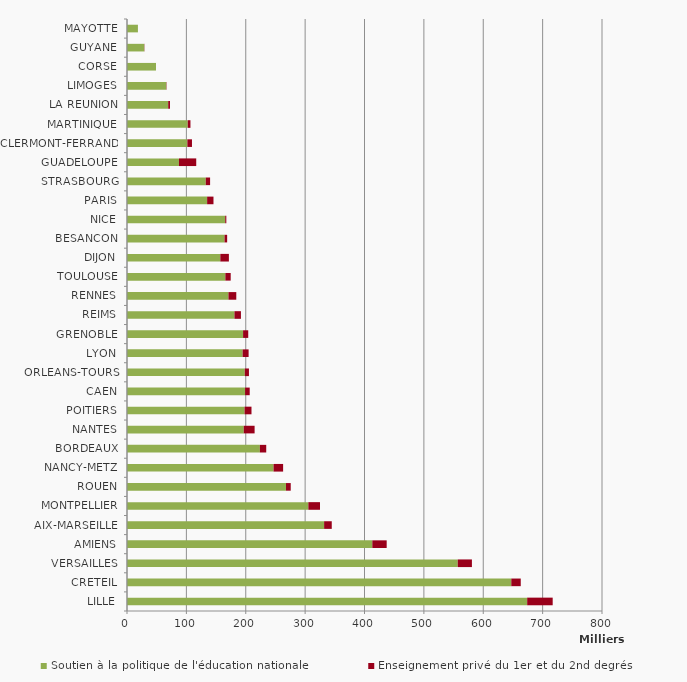
| Category | Soutien à la politique de l'éducation nationale | Enseignement privé du 1er et du 2nd degrés |
|---|---|---|
| LILLE | 673984 | 42970 |
| CRETEIL | 647215 | 15950 |
| VERSAILLES | 557060 | 23845 |
| AMIENS | 413163.85 | 24200 |
| AIX-MARSEILLE | 331990 | 12860 |
| MONTPELLIER | 305428.96 | 19590 |
| ROUEN | 267758 | 8000 |
| NANCY-METZ | 246829 | 16103 |
| BORDEAUX | 223792.66 | 10700 |
| NANTES | 196648.45 | 18270 |
| POITIERS | 198015.26 | 11654 |
| CAEN | 198858 | 7816 |
| ORLEANS-TOURS | 198366 | 7014 |
| LYON | 194710 | 10120 |
| GRENOBLE | 195501 | 8700 |
| REIMS | 180990 | 10900 |
| RENNES | 170862 | 13200 |
| TOULOUSE | 165645 | 9000 |
| DIJON | 157191.43 | 14400 |
| BESANCON | 164274 | 4400 |
| NICE | 165393.38 | 1900 |
| PARIS | 134950 | 10700 |
| STRASBOURG | 132650 | 7300 |
| GUADELOUPE | 87500 | 29100 |
| CLERMONT-FERRAND | 101655 | 7771 |
| MARTINIQUE | 102360 | 4500 |
| LA REUNION | 69400 | 3000 |
| LIMOGES | 66159.26 | 500 |
| CORSE | 48810 | 0 |
| GUYANE | 29064 | 363 |
| MAYOTTE | 18400 | 0 |